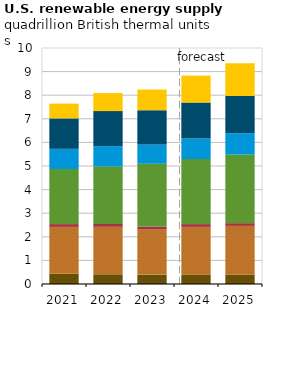
| Category | Other biomass | Wood biomass | Geothermal | Liquid biofuels | Hydropower | Wind power | Solar |
|---|---|---|---|---|---|---|---|
| 2021.0 | 0.43 | 1.989 | 0.118 | 2.331 | 0.858 | 1.289 | 0.627 |
| 2022.0 | 0.412 | 2.012 | 0.118 | 2.433 | 0.869 | 1.481 | 0.765 |
| 2023.0 | 0.398 | 1.918 | 0.12 | 2.659 | 0.818 | 1.45 | 0.878 |
| 2024.0 | 0.396 | 2.024 | 0.117 | 2.758 | 0.87 | 1.522 | 1.145 |
| 2025.0 | 0.393 | 2.071 | 0.114 | 2.901 | 0.916 | 1.572 | 1.384 |